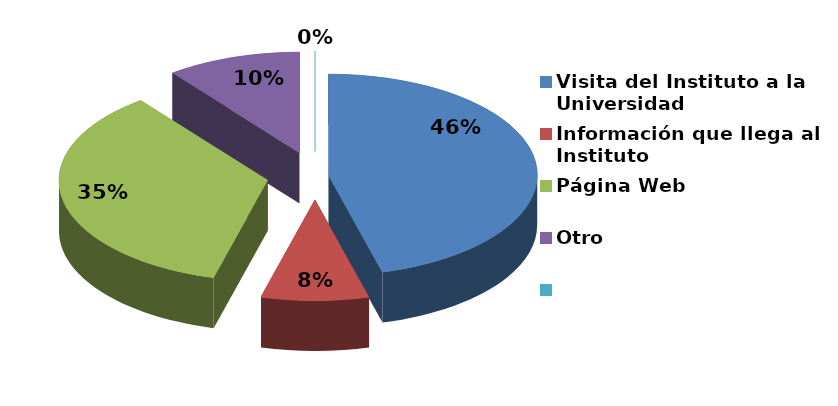
| Category | Series 0 |
|---|---|
| Visita del Instituto a la Universidad | 22 |
| Información que llega al Instituto | 4 |
| Página Web | 17 |
| Otro | 5 |